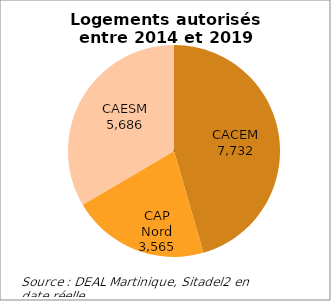
| Category | Series 0 |
|---|---|
| CACEM | 7732 |
| CAP Nord | 3565 |
| CAESM | 5686 |